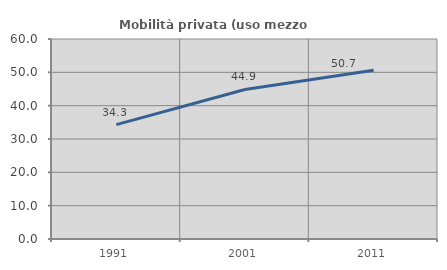
| Category | Mobilità privata (uso mezzo privato) |
|---|---|
| 1991.0 | 34.323 |
| 2001.0 | 44.867 |
| 2011.0 | 50.653 |